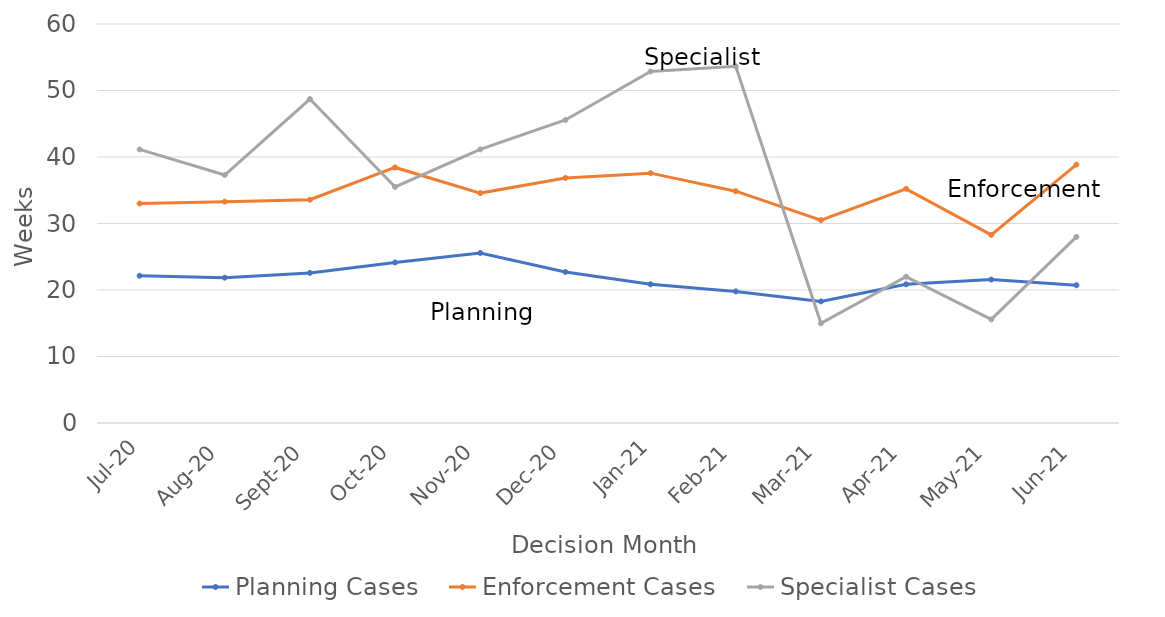
| Category | Planning Cases | Enforcement Cases | Specialist Cases |
|---|---|---|---|
| 2020-07-01 | 22.143 | 33 | 41.143 |
| 2020-08-01 | 21.857 | 33.286 | 37.286 |
| 2020-09-01 | 22.571 | 33.571 | 48.714 |
| 2020-10-01 | 24.143 | 38.429 | 35.5 |
| 2020-11-01 | 25.571 | 34.571 | 41.143 |
| 2020-12-01 | 22.714 | 36.857 | 45.571 |
| 2021-01-01 | 20.857 | 37.571 | 52.857 |
| 2021-02-01 | 19.786 | 34.857 | 53.643 |
| 2021-03-01 | 18.286 | 30.5 | 15 |
| 2021-04-01 | 20.857 | 35.214 | 22 |
| 2021-05-01 | 21.571 | 28.286 | 15.571 |
| 2021-06-01 | 20.714 | 38.857 | 28 |